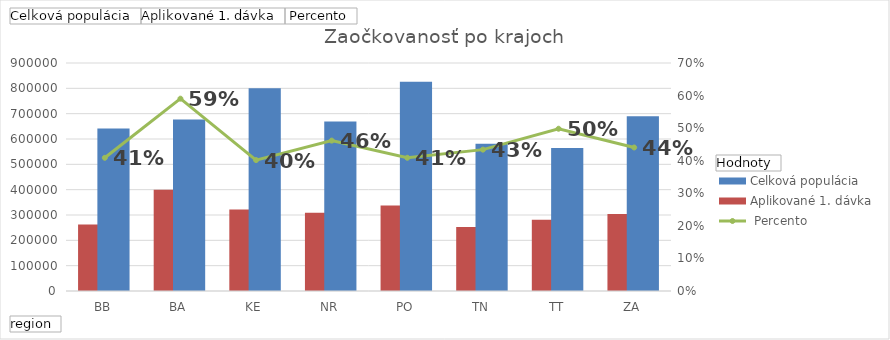
| Category | Aplikované 1. dávka | Celková populácia |
|---|---|---|
| BB | 262265 | 641347 |
| BA | 399816 | 677121 |
| KE | 321779 | 800580 |
| NR | 308882 | 668948 |
| PO | 337932 | 826299 |
| TN | 252150 | 581005 |
| TT | 281072 | 564206 |
| ZA | 304170 | 690285 |